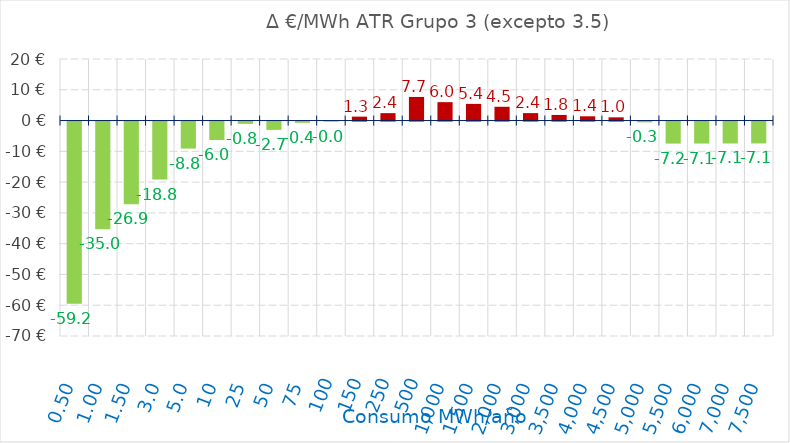
| Category | D €/MWh |
|---|---|
| 0.5 | -59.171 |
| 1.0 | -34.967 |
| 1.5 | -26.899 |
| 3.0 | -18.831 |
| 5.0 | -8.788 |
| 10.0 | -6 |
| 25.0 | -0.751 |
| 50.0 | -2.707 |
| 75.0 | -0.402 |
| 100.0 | -0.048 |
| 150.0 | 1.27 |
| 250.0 | 2.408 |
| 500.0 | 7.672 |
| 1000.0 | 5.981 |
| 1500.0 | 5.417 |
| 2000.0 | 4.475 |
| 3000.0 | 2.415 |
| 3500.0 | 1.827 |
| 4000.0 | 1.385 |
| 4500.0 | 1.042 |
| 5000.0 | -0.255 |
| 5500.0 | -7.161 |
| 6000.0 | -7.146 |
| 7000.0 | -7.123 |
| 7500.0 | -7.113 |